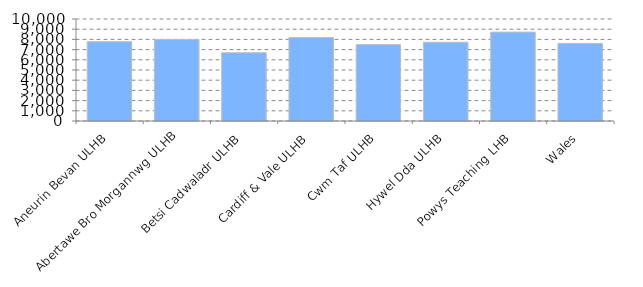
| Category | Average patient list size per practice |
|---|---|
| Aneurin Bevan ULHB | 7774.494 |
| Abertawe Bro Morgannwg ULHB | 7998.232 |
| Betsi Cadwaladr ULHB | 6692.123 |
| Cardiff & Vale ULHB | 8183.825 |
| Cwm Taf ULHB | 7487.732 |
| Hywel Dda ULHB | 7723.078 |
| Powys Teaching LHB | 8714.625 |
| Wales | 7603.099 |